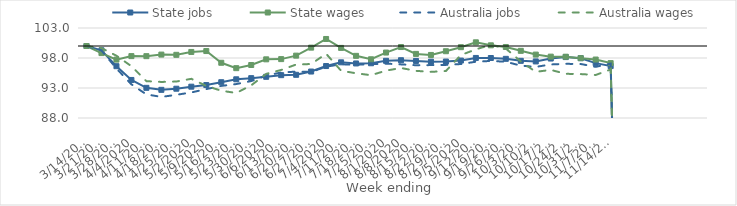
| Category | State jobs | State wages | Australia jobs | Australia wages |
|---|---|---|---|---|
| 14/03/2020 | 100 | 100 | 100 | 100 |
| 21/03/2020 | 99.288 | 98.817 | 99.252 | 99.658 |
| 28/03/2020 | 96.634 | 97.732 | 96.25 | 98.378 |
| 04/04/2020 | 94.341 | 98.313 | 93.61 | 96.634 |
| 11/04/2020 | 93.028 | 98.306 | 91.936 | 94.139 |
| 18/04/2020 | 92.694 | 98.569 | 91.515 | 94.01 |
| 25/04/2020 | 92.881 | 98.53 | 91.861 | 94.076 |
| 02/05/2020 | 93.221 | 99.01 | 92.263 | 94.531 |
| 09/05/2020 | 93.49 | 99.159 | 92.818 | 93.346 |
| 16/05/2020 | 93.964 | 97.205 | 93.348 | 92.542 |
| 23/05/2020 | 94.449 | 96.305 | 93.657 | 92.17 |
| 30/05/2020 | 94.642 | 96.831 | 94.157 | 93.446 |
| 06/06/2020 | 94.864 | 97.778 | 95.081 | 95.354 |
| 13/06/2020 | 95.139 | 97.814 | 95.581 | 96.009 |
| 20/06/2020 | 95.198 | 98.394 | 95.73 | 96.914 |
| 27/06/2020 | 95.743 | 99.727 | 95.677 | 96.999 |
| 04/07/2020 | 96.66 | 101.171 | 96.551 | 98.71 |
| 11/07/2020 | 97.281 | 99.682 | 96.956 | 95.878 |
| 18/07/2020 | 97.09 | 98.359 | 96.874 | 95.454 |
| 25/07/2020 | 97.124 | 97.787 | 96.966 | 95.136 |
| 01/08/2020 | 97.533 | 98.908 | 97.062 | 95.894 |
| 08/08/2020 | 97.631 | 99.826 | 96.936 | 96.337 |
| 15/08/2020 | 97.51 | 98.682 | 96.797 | 95.858 |
| 22/08/2020 | 97.389 | 98.508 | 96.815 | 95.687 |
| 29/08/2020 | 97.41 | 99.128 | 96.851 | 95.834 |
| 05/09/2020 | 97.571 | 99.804 | 96.995 | 98.49 |
| 12/09/2020 | 98.01 | 100.613 | 97.381 | 99.44 |
| 19/09/2020 | 97.999 | 100.113 | 97.514 | 100.193 |
| 26/09/2020 | 97.862 | 99.836 | 97.375 | 99.575 |
| 03/10/2020 | 97.529 | 99.195 | 96.725 | 97.427 |
| 10/10/2020 | 97.43 | 98.569 | 96.517 | 95.692 |
| 17/10/2020 | 97.909 | 98.229 | 96.926 | 96.016 |
| 24/10/2020 | 98.152 | 98.215 | 97.027 | 95.365 |
| 31/10/2020 | 97.97 | 97.972 | 97.003 | 95.32 |
| 07/11/2020 | 97.147 | 97.743 | 96.523 | 95.17 |
| 14/11/2020 | 96.652 | 97.15 | 97.067 | 96.091 |